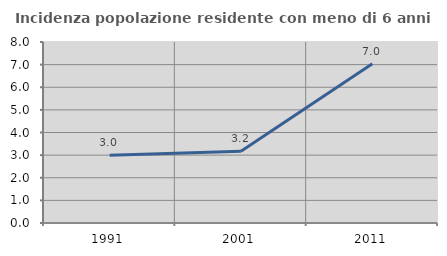
| Category | Incidenza popolazione residente con meno di 6 anni |
|---|---|
| 1991.0 | 2.997 |
| 2001.0 | 3.17 |
| 2011.0 | 7.04 |